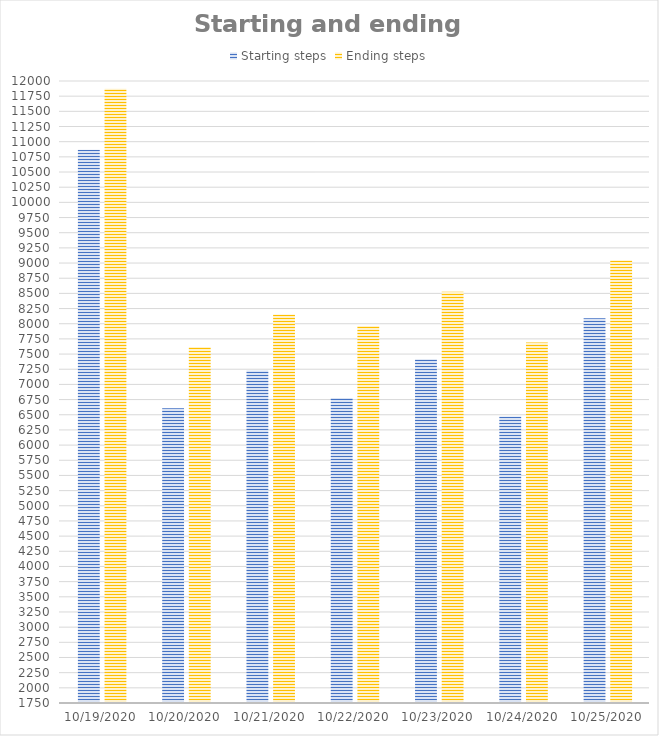
| Category | Starting steps | Ending steps |
|---|---|---|
| 10/19/20 | 10868 | 11873 |
| 10/20/20 | 6607 | 7616 |
| 10/21/20 | 7230 | 8154 |
| 10/22/20 | 6776 | 7962 |
| 10/23/20 | 7415 | 8525 |
| 10/24/20 | 6471 | 7691 |
| 10/25/20 | 8091 | 9045 |